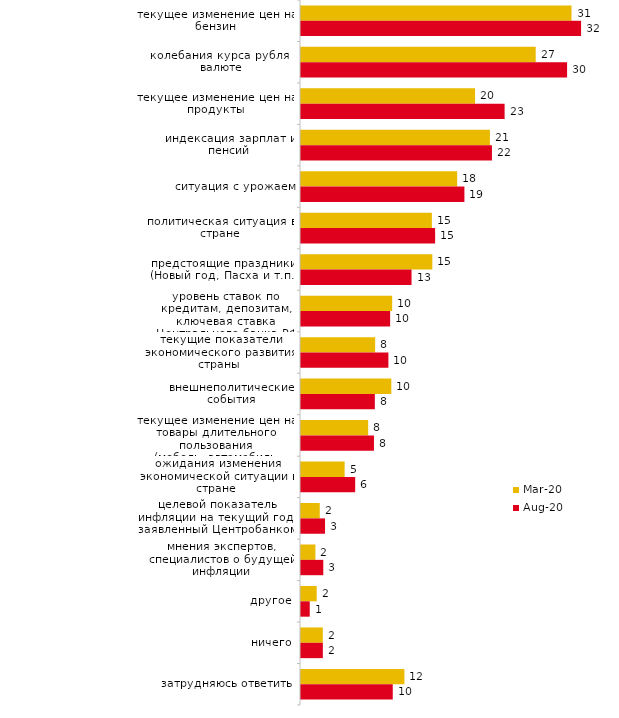
| Category | мар.20 | авг.20 |
|---|---|---|
| текущее изменение цен на бензин | 30.739 | 31.827 |
| колебания курса рубля к валюте | 26.673 | 30.238 |
| текущее изменение цен на продукты | 19.782 | 23.138 |
| индексация зарплат и пенсий | 21.468 | 21.698 |
| ситуация с урожаем | 17.749 | 18.57 |
| политическая ситуация в стране | 14.874 | 15.243 |
| предстоящие праздники (Новый год, Пасха и т.п.) | 14.923 | 12.562 |
| уровень ставок по кредитам, депозитам, ключевая ставка Центрального банка РФ | 10.362 | 10.129 |
| текущие показатели экономического развития страны | 8.428 | 9.93 |
| внешнеполитические события | 10.263 | 8.391 |
| текущее изменение цен на товары длительного пользования (мебель, автомобиль, бытовая техника и т.п.) | 7.635 | 8.292 |
| ожидания изменения экономической ситуации в стране | 4.958 | 6.157 |
| целевой показатель инфляции на текущий год, заявленный Центробанком | 2.132 | 2.731 |
| мнения экспертов, специалистов о будущей инфляции | 1.636 | 2.532 |
| другое | 1.785 | 0.993 |
| ничего | 2.479 | 2.483 |
| затрудняюсь ответить | 11.75 | 10.427 |